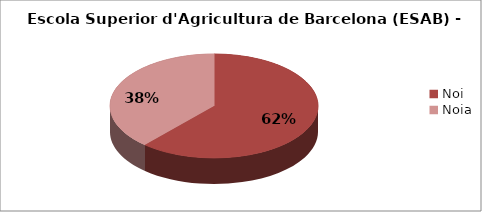
| Category | Escola Superior d'Agricultura de Barcelona (ESAB) - Gènere |
|---|---|
| Noi | 0.615 |
| Noia | 0.385 |